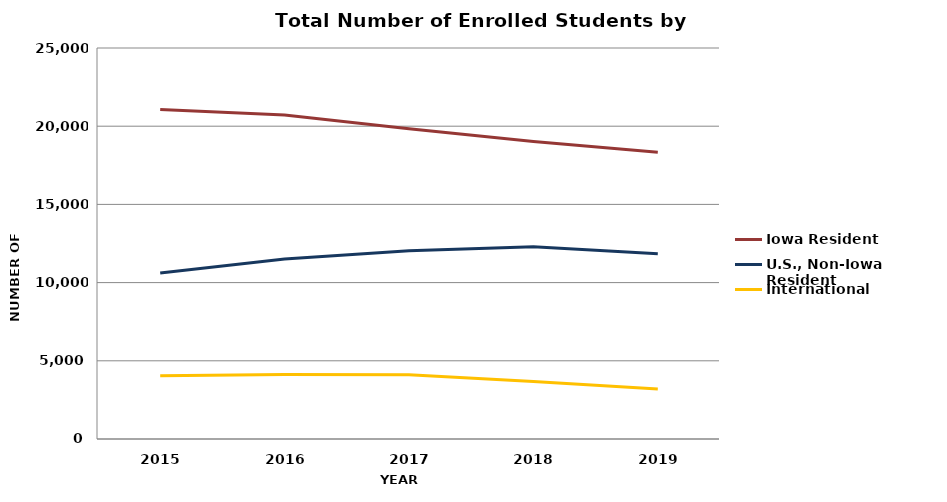
| Category | Iowa Resident | U.S., Non-Iowa Resident | International |
|---|---|---|---|
| 2015.0 | 21064 | 10609 | 4041 |
| 2016.0 | 20713 | 11509 | 4131 |
| 2017.0 | 19843 | 12035 | 4115 |
| 2018.0 | 19022 | 12299 | 3671 |
| 2019.0 | 18341 | 11852 | 3198 |